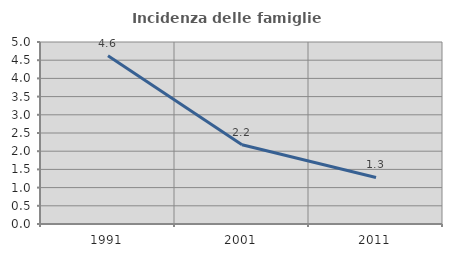
| Category | Incidenza delle famiglie numerose |
|---|---|
| 1991.0 | 4.625 |
| 2001.0 | 2.177 |
| 2011.0 | 1.278 |